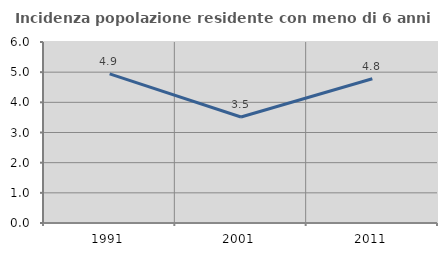
| Category | Incidenza popolazione residente con meno di 6 anni |
|---|---|
| 1991.0 | 4.943 |
| 2001.0 | 3.512 |
| 2011.0 | 4.783 |